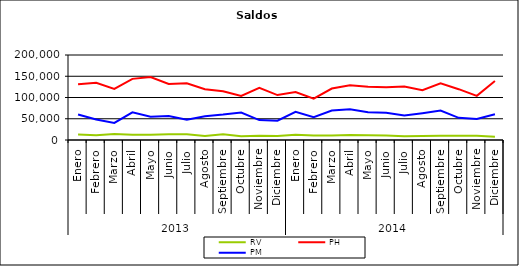
| Category | RV | PH | PM |
|---|---|---|---|
| 0 | 12966.437 | 131380.856 | 59975.653 |
| 1 | 11432.271 | 134655.891 | 48046.612 |
| 2 | 14149.543 | 120343.782 | 40297.909 |
| 3 | 12403.249 | 143830.507 | 64946.114 |
| 4 | 12323.134 | 148139.781 | 54592.514 |
| 5 | 13759.976 | 131634.752 | 56652.701 |
| 6 | 13256.014 | 133515.147 | 47907.561 |
| 7 | 9335.8 | 119600.732 | 55860.576 |
| 8 | 13362.811 | 114843.232 | 59771.51 |
| 9 | 9080.978 | 103607.627 | 64696.186 |
| 10 | 9993.913 | 122533.872 | 46801.148 |
| 11 | 9303.464 | 105747.395 | 45455.331 |
| 12 | 12145.055 | 112918.262 | 66200.17 |
| 13 | 10742.048 | 97242.789 | 53817.215 |
| 14 | 10795.854 | 121097.504 | 69409.543 |
| 15 | 11604.091 | 128798.176 | 72161.549 |
| 16 | 11264.83 | 125268.689 | 65570.493 |
| 17 | 10724.052 | 123922.82 | 64054.99 |
| 18 | 9051.652 | 126086.706 | 57402.892 |
| 19 | 9700.076 | 117038.593 | 63086.988 |
| 20 | 9709.733 | 133155.935 | 69429.611 |
| 21 | 10060.869 | 119576.756 | 52179.353 |
| 22 | 9755.94 | 103925.451 | 49698.972 |
| 23 | 7434.237 | 138989.215 | 60568.524 |